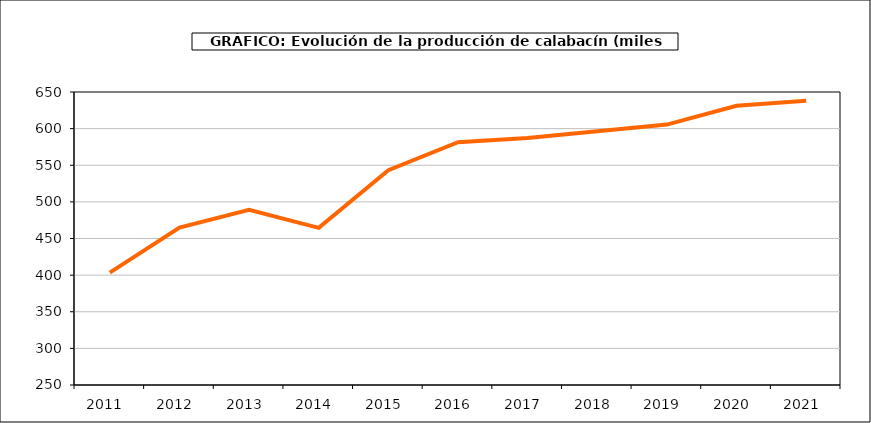
| Category | producción |
|---|---|
| 2011.0 | 403.38 |
| 2012.0 | 465.039 |
| 2013.0 | 489.297 |
| 2014.0 | 464.496 |
| 2015.0 | 543.195 |
| 2016.0 | 581.503 |
| 2017.0 | 587.174 |
| 2018.0 | 596.315 |
| 2019.0 | 605.527 |
| 2020.0 | 631.244 |
| 2021.0 | 638.158 |